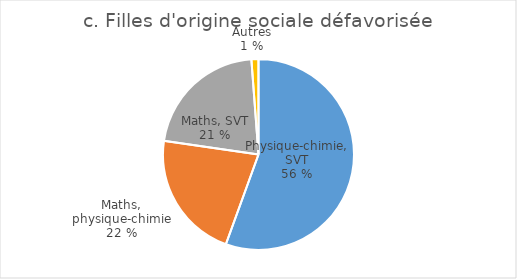
| Category | Filles d'origine sociale défavorisée |
|---|---|
| Physique-chimie, SVT | 6797 |
| Mathématiques, physique-chimie | 2661 |
| Mathématiques, SVT | 2633 |
| Autres | 146 |